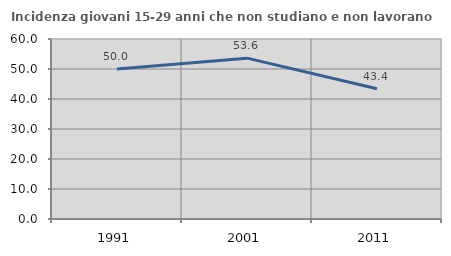
| Category | Incidenza giovani 15-29 anni che non studiano e non lavorano  |
|---|---|
| 1991.0 | 50 |
| 2001.0 | 53.612 |
| 2011.0 | 43.401 |